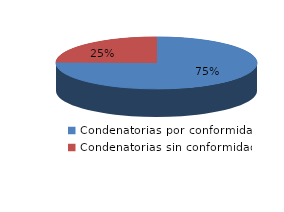
| Category | Series 0 |
|---|---|
| 0 | 1230 |
| 1 | 403 |